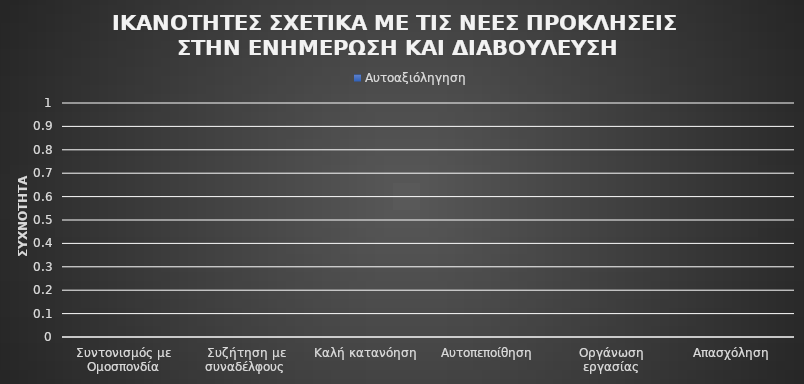
| Category | Αυτοαξιόληγηση |
|---|---|
| Συντονισμός με Ομοσπονδία | 0 |
| Συζήτηση με συναδέλφους | 0 |
| Καλή κατανόηση | 0 |
| Αυτοπεποίθηση | 0 |
| Οργάνωση εργασίας | 0 |
| Απασχόληση | 0 |